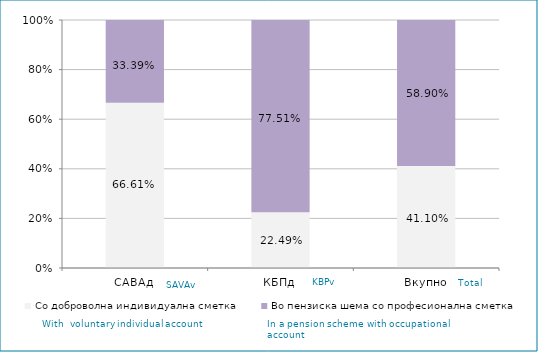
| Category | Со доброволна индивидуална сметка  | Во пензиска шема со професионална сметка |
|---|---|---|
| САВАд | 0.666 | 0.334 |
| КБПд | 0.225 | 0.775 |
| Вкупно | 0.411 | 0.589 |